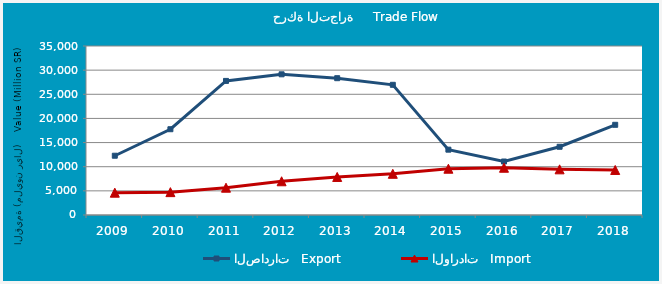
| Category | الصادرات   Export | الواردات   Import |
|---|---|---|
| 2009.0 | 12274072348 | 4622750221 |
| 2010.0 | 17762754884 | 4735470844 |
| 2011.0 | 27769822511 | 5655150016 |
| 2012.0 | 29134339589 | 6984405555 |
| 2013.0 | 28333601845 | 7876773737 |
| 2014.0 | 26962388581 | 8536111182 |
| 2015.0 | 13529695768 | 9586654532 |
| 2016.0 | 11076802620 | 9787696024 |
| 2017.0 | 14131327808 | 9458026846 |
| 2018.0 | 18679465588 | 9327044489 |